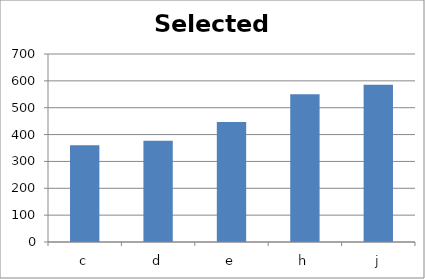
| Category | Selected Only |
|---|---|
| c | 359.85 |
| d | 376.94 |
| e | 446.86 |
| h | 549.9 |
| j | 585.2 |